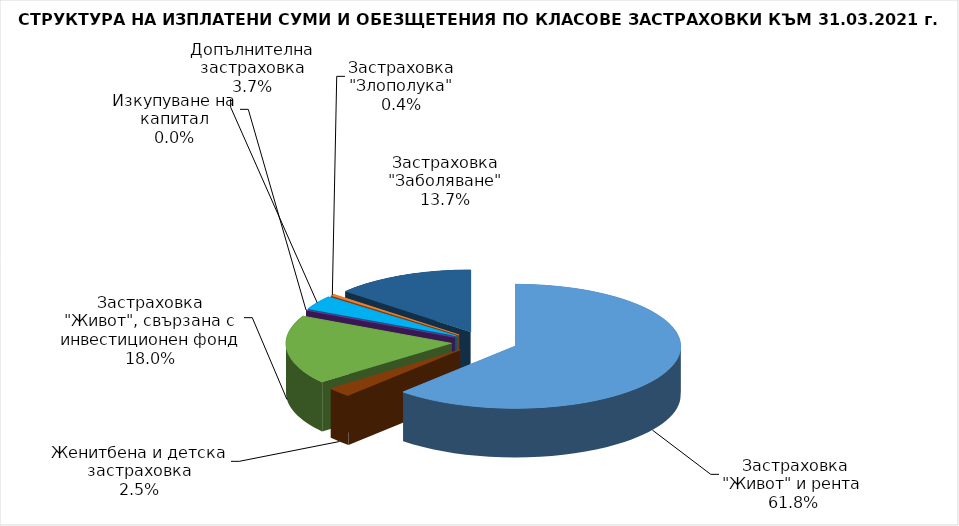
| Category |  Застраховка "Живот" и рента |
|---|---|
|  Застраховка "Живот" и рента | 35326902.017 |
| Женитбена и детска застраховка | 1422254.344 |
| Застраховка "Живот", свързана с инвестиционен фонд | 10269406.108 |
| Изкупуване на капитал | 0 |
| Допълнителна застраховка | 2088611.377 |
| Застраховка "Злополука" | 255500.64 |
| Застраховка "Заболяване" | 7807234.06 |